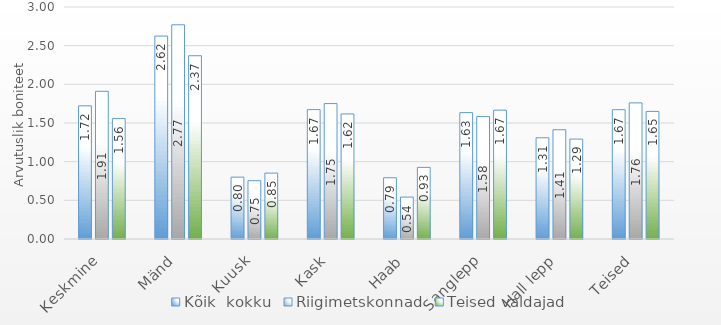
| Category | Kõik  kokku | Riigimetskonnad | Teised valdajad |
|---|---|---|---|
| Keskmine | 1.722 | 1.91 | 1.557 |
| Mänd | 2.624 | 2.77 | 2.37 |
| Kuusk | 0.8 | 0.754 | 0.852 |
| Kask | 1.673 | 1.751 | 1.617 |
| Haab | 0.792 | 0.542 | 0.926 |
| Sanglepp | 1.634 | 1.583 | 1.666 |
| Hall lepp | 1.309 | 1.413 | 1.292 |
| Teised | 1.672 | 1.76 | 1.65 |